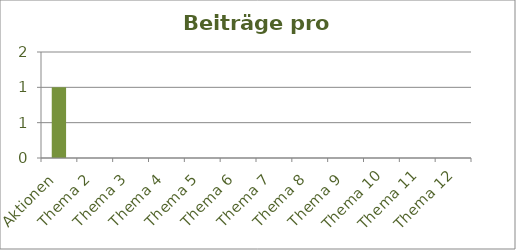
| Category | Beiträge |
|---|---|
| Aktionen | 1 |
| Thema 2 | 0 |
| Thema 3 | 0 |
| Thema 4 | 0 |
| Thema 5 | 0 |
| Thema 6 | 0 |
| Thema 7 | 0 |
| Thema 8 | 0 |
| Thema 9 | 0 |
| Thema 10 | 0 |
| Thema 11 | 0 |
| Thema 12 | 0 |